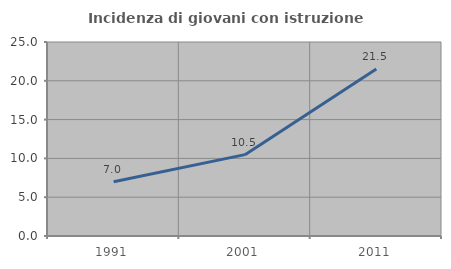
| Category | Incidenza di giovani con istruzione universitaria |
|---|---|
| 1991.0 | 7 |
| 2001.0 | 10.484 |
| 2011.0 | 21.519 |